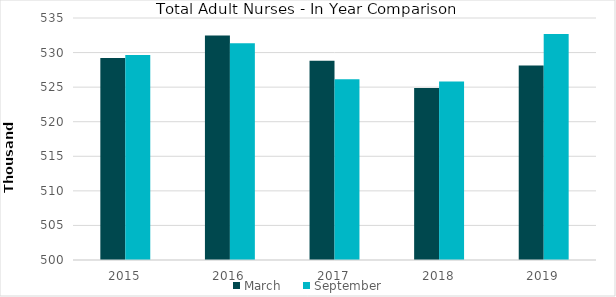
| Category | March | September |
|---|---|---|
| 2015.0 | 529200 | 529648 |
| 2016.0 | 532469 | 531331 |
| 2017.0 | 528818 | 526152 |
| 2018.0 | 524891 | 525819 |
| 2019.0 | 528146 | 532703 |